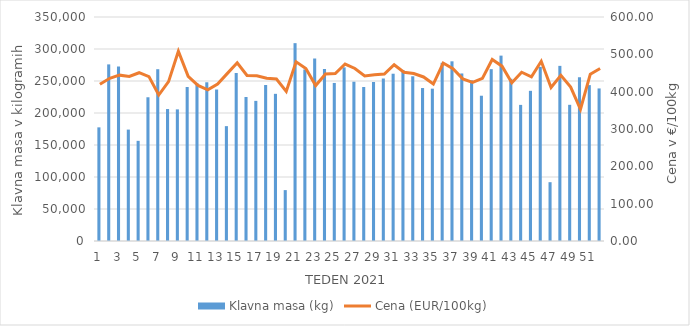
| Category | Klavna masa (kg) |
|---|---|
| 1.0 | 177573 |
| 2.0 | 275951 |
| 3.0 | 272797 |
| 4.0 | 174056 |
| 5.0 | 156508 |
| 6.0 | 224595 |
| 7.0 | 268436 |
| 8.0 | 206193 |
| 9.0 | 205669 |
| 10.0 | 240592 |
| 11.0 | 246325 |
| 12.0 | 248020 |
| 13.0 | 236703 |
| 14.0 | 179478 |
| 15.0 | 262544 |
| 16.0 | 225033 |
| 17.0 | 218950 |
| 18.0 | 243711 |
| 19.0 | 229955 |
| 20.0 | 79521 |
| 21.0 | 309134 |
| 22.0 | 268074 |
| 23.0 | 285151 |
| 24.0 | 268579 |
| 25.0 | 246944 |
| 26.0 | 271319 |
| 27.0 | 248858 |
| 28.0 | 240609 |
| 29.0 | 248383 |
| 30.0 | 253894 |
| 31.0 | 261374 |
| 32.0 | 267142 |
| 33.0 | 257352 |
| 34.0 | 239018 |
| 35.0 | 238034 |
| 36.0 | 278443 |
| 37.0 | 280772 |
| 38.0 | 261791 |
| 39.0 | 250972 |
| 40.0 | 226992 |
| 41.0 | 268523 |
| 42.0 | 289650 |
| 43.0 | 253458 |
| 44.0 | 212689 |
| 45.0 | 234635 |
| 46.0 | 272042 |
| 47.0 | 91884 |
| 48.0 | 273642 |
| 49.0 | 212789 |
| 50.0 | 255740 |
| 51.0 | 243582 |
| 52.0 | 238372 |